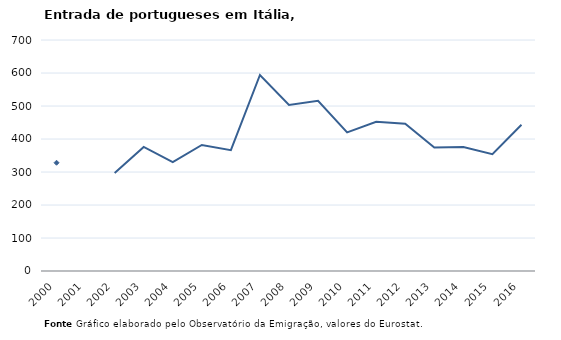
| Category | Entradas |
|---|---|
| 2000.0 | 328 |
| 2001.0 | 0 |
| 2002.0 | 297 |
| 2003.0 | 376 |
| 2004.0 | 330 |
| 2005.0 | 382 |
| 2006.0 | 366 |
| 2007.0 | 594 |
| 2008.0 | 503 |
| 2009.0 | 516 |
| 2010.0 | 420 |
| 2011.0 | 452 |
| 2012.0 | 446 |
| 2013.0 | 374 |
| 2014.0 | 376 |
| 2015.0 | 354 |
| 2016.0 | 443 |